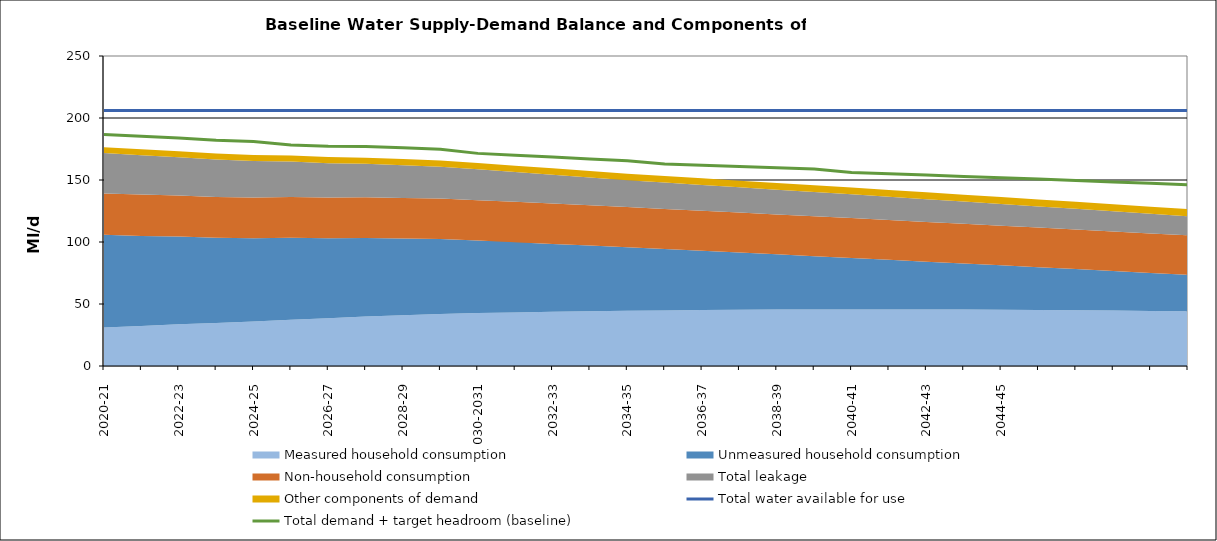
| Category | Total water available for use | Total demand + target headroom (baseline) |
|---|---|---|
| 2020-21 | 206.048 | 186.689 |
| 2021-22 | 206.048 | 185.309 |
| 2022-23 | 206.048 | 183.84 |
| 2023-24 | 206.048 | 182.019 |
| 2024-25 | 206.048 | 181.035 |
| 2025-26 | 206.048 | 178.282 |
| 2026-27 | 206.048 | 177.265 |
| 2027-28 | 206.048 | 176.939 |
| 2028-29 | 206.048 | 175.909 |
| 2029-30 | 206.048 | 174.813 |
| 2030-31 | 206.048 | 171.469 |
| 2031-32 | 206.048 | 170.044 |
| 2032-33 | 206.048 | 168.542 |
| 2033-34 | 206.048 | 167.016 |
| 2034-35 | 206.048 | 165.54 |
| 2035-36 | 206.048 | 162.972 |
| 2036-37 | 206.048 | 161.897 |
| 2037-38 | 206.048 | 160.847 |
| 2038-39 | 206.048 | 159.797 |
| 2039-40 | 206.048 | 158.894 |
| 2040-41 | 206.048 | 156.053 |
| 2041-42 | 206.048 | 155.033 |
| 2042-43 | 206.048 | 153.974 |
| 2043-44 | 206.048 | 152.852 |
| 2044-45 | 206.048 | 151.87 |
| 2045-46 | 206.048 | 150.813 |
| 2046-47 | 206.048 | 149.683 |
| 2047-48 | 206.048 | 148.474 |
| 2048-49 | 206.048 | 147.284 |
| 2049-50 | 206.048 | 146.124 |